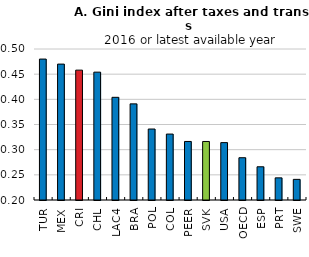
| Category | B. |
|---|---|
| TUR | 0.48 |
| MEX | 0.47 |
| CRI | 0.458 |
| CHL | 0.454 |
| LAC4 | 0.404 |
| BRA | 0.391 |
| POL | 0.341 |
| COL | 0.331 |
| PEER | 0.316 |
| SVK | 0.316 |
| USA | 0.314 |
| OECD | 0.284 |
| ESP | 0.266 |
| PRT | 0.244 |
| SWE | 0.241 |